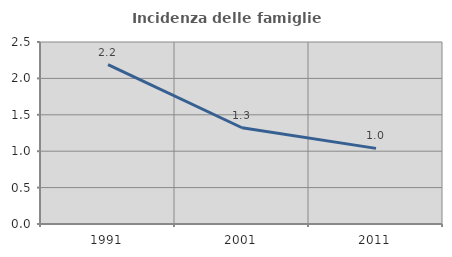
| Category | Incidenza delle famiglie numerose |
|---|---|
| 1991.0 | 2.189 |
| 2001.0 | 1.322 |
| 2011.0 | 1.039 |